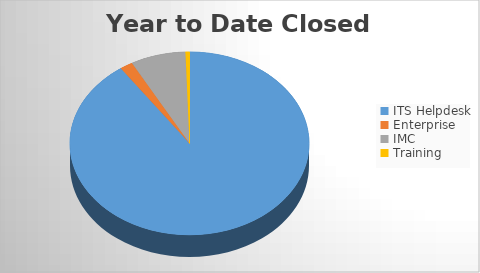
| Category | YTD Closed Tickets | 6M Opened |
|---|---|---|
| ITS Helpdesk | 2477 | 2456 |
| Enterprise | 48 | 42 |
| IMC | 204 | 204 |
| Training | 15 | 15 |